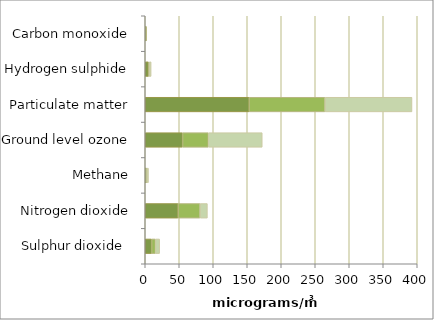
| Category | أبوظبي | العين | المنطقة الغربية |
|---|---|---|---|
| Sulphur dioxide  | 9.4 | 5.6 | 6.2 |
| Nitrogen dioxide | 48.3 | 32.3 | 10.8 |
| Methane | 0.682 | 1.855 | 2.21 |
| Ground level ozone | 54.9 | 37.9 | 79.27 |
| Particulate matter | 152.7 | 111.7 | 127.9 |
| Hydrogen sulphide | 4.48 | 1.88 | 2.315 |
| Carbon monoxide | 1.04 | 0.85 | 0 |